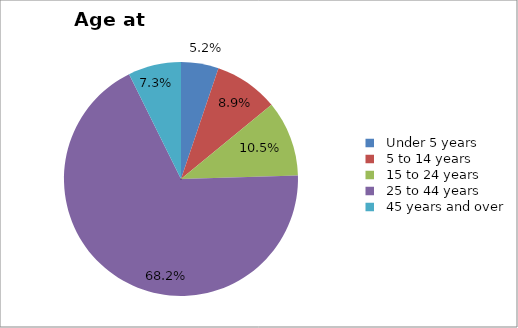
| Category | Series 0 |
|---|---|
|   Under 5 years | 1475 |
|   5 to 14 years | 2525 |
|   15 to 24 years | 2975 |
|   25 to 44 years | 19370 |
|   45 years and over | 2080 |